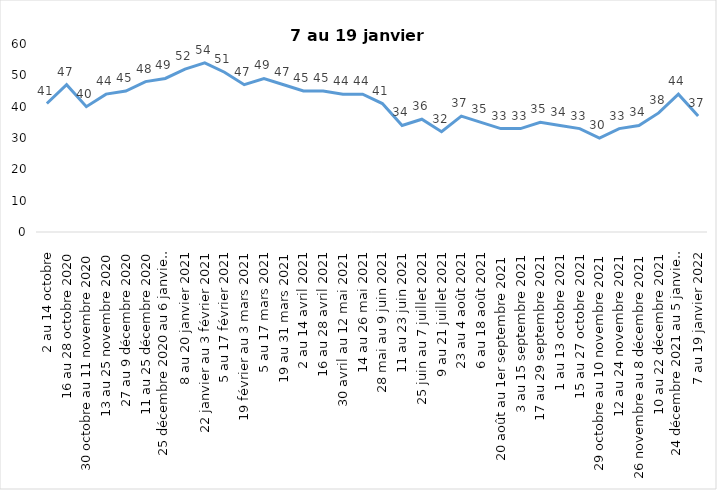
| Category | Toujours aux trois mesures |
|---|---|
| 2 au 14 octobre | 41 |
| 16 au 28 octobre 2020 | 47 |
| 30 octobre au 11 novembre 2020 | 40 |
| 13 au 25 novembre 2020 | 44 |
| 27 au 9 décembre 2020 | 45 |
| 11 au 25 décembre 2020 | 48 |
| 25 décembre 2020 au 6 janvier 2021 | 49 |
| 8 au 20 janvier 2021 | 52 |
| 22 janvier au 3 février 2021 | 54 |
| 5 au 17 février 2021 | 51 |
| 19 février au 3 mars 2021 | 47 |
| 5 au 17 mars 2021 | 49 |
| 19 au 31 mars 2021 | 47 |
| 2 au 14 avril 2021 | 45 |
| 16 au 28 avril 2021 | 45 |
| 30 avril au 12 mai 2021 | 44 |
| 14 au 26 mai 2021 | 44 |
| 28 mai au 9 juin 2021 | 41 |
| 11 au 23 juin 2021 | 34 |
| 25 juin au 7 juillet 2021 | 36 |
| 9 au 21 juillet 2021 | 32 |
| 23 au 4 août 2021 | 37 |
| 6 au 18 août 2021 | 35 |
| 20 août au 1er septembre 2021 | 33 |
| 3 au 15 septembre 2021 | 33 |
| 17 au 29 septembre 2021 | 35 |
| 1 au 13 octobre 2021 | 34 |
| 15 au 27 octobre 2021 | 33 |
| 29 octobre au 10 novembre 2021 | 30 |
| 12 au 24 novembre 2021 | 33 |
| 26 novembre au 8 décembre 2021 | 34 |
| 10 au 22 décembre 2021 | 38 |
| 24 décembre 2021 au 5 janvier 2022 2022 | 44 |
| 7 au 19 janvier 2022 | 37 |